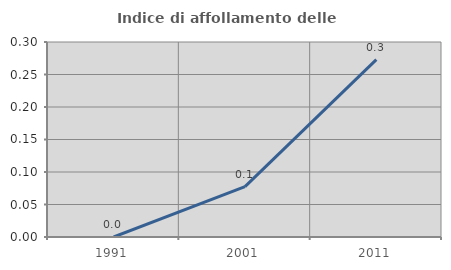
| Category | Indice di affollamento delle abitazioni  |
|---|---|
| 1991.0 | 0 |
| 2001.0 | 0.078 |
| 2011.0 | 0.273 |